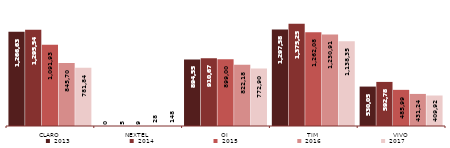
| Category | 2013 | 2014 | 2015 | 2016 | 2017 |
|---|---|---|---|---|---|
| CLARO | 1266634 | 1295541 | 1091938 | 845703 | 781849 |
| NEXTEL | 0 | 5 | 9 | 28 | 148 |
| OI | 894558 | 910678 | 899009 | 822186 | 772900 |
| TIM | 1297585 | 1375257 | 1262086 | 1230912 | 1138359 |
| VIVO | 530053 | 592785 | 485990 | 431242 | 409926 |